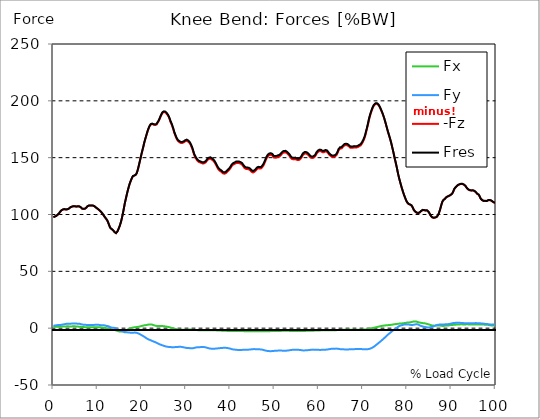
| Category |  Fx |  Fy |  -Fz |  Fres |
|---|---|---|---|---|
| 0.0 | 1.227 | 2.189 | 97.639 | 97.701 |
| 0.167348456675344 | 1.218 | 2.242 | 97.904 | 97.965 |
| 0.334696913350688 | 1.208 | 2.295 | 98.167 | 98.229 |
| 0.5020453700260321 | 1.224 | 2.42 | 98.421 | 98.483 |
| 0.669393826701376 | 1.251 | 2.552 | 98.758 | 98.821 |
| 0.83674228337672 | 1.284 | 2.647 | 99.334 | 99.397 |
| 1.0040907400520642 | 1.323 | 2.751 | 99.869 | 99.934 |
| 1.1621420602454444 | 1.335 | 2.792 | 100.426 | 100.49 |
| 1.3294905169207885 | 1.286 | 2.74 | 101.25 | 101.312 |
| 1.4968389735961325 | 1.319 | 2.765 | 102.236 | 102.298 |
| 1.6641874302714765 | 1.383 | 2.858 | 103.057 | 103.12 |
| 1.8315358869468206 | 1.393 | 2.967 | 103.669 | 103.733 |
| 1.9988843436221646 | 1.413 | 3.104 | 104.091 | 104.156 |
| 2.1662328002975086 | 1.427 | 3.234 | 104.389 | 104.458 |
| 2.333581256972853 | 1.452 | 3.364 | 104.589 | 104.661 |
| 2.5009297136481967 | 1.5 | 3.498 | 104.671 | 104.748 |
| 2.6682781703235405 | 1.525 | 3.621 | 104.635 | 104.716 |
| 2.8356266269988843 | 1.55 | 3.722 | 104.374 | 104.458 |
| 3.002975083674229 | 1.593 | 3.837 | 104.363 | 104.45 |
| 3.1703235403495724 | 1.637 | 3.936 | 104.536 | 104.626 |
| 3.337671997024917 | 1.618 | 3.928 | 104.8 | 104.89 |
| 3.4957233172182973 | 1.55 | 3.887 | 105.133 | 105.22 |
| 3.663071773893641 | 1.507 | 3.91 | 105.745 | 105.833 |
| 3.8304202305689854 | 1.492 | 3.934 | 106.253 | 106.342 |
| 3.997768687244329 | 1.521 | 3.979 | 106.552 | 106.642 |
| 4.165117143919673 | 1.573 | 4.021 | 106.832 | 106.923 |
| 4.332465600595017 | 1.604 | 4.064 | 107.047 | 107.14 |
| 4.499814057270361 | 1.614 | 4.112 | 107.211 | 107.307 |
| 4.667162513945706 | 1.615 | 4.148 | 107.327 | 107.424 |
| 4.834510970621049 | 1.587 | 4.143 | 107.241 | 107.338 |
| 5.001859427296393 | 1.576 | 4.159 | 107.006 | 107.104 |
| 5.169207883971737 | 1.563 | 4.107 | 106.921 | 107.019 |
| 5.336556340647081 | 1.485 | 3.984 | 106.991 | 107.082 |
| 5.503904797322425 | 1.413 | 3.951 | 107.129 | 107.218 |
| 5.671253253997769 | 1.353 | 3.913 | 107.203 | 107.291 |
| 5.82930457419115 | 1.322 | 3.869 | 107.107 | 107.193 |
| 5.996653030866494 | 1.302 | 3.783 | 106.836 | 106.92 |
| 6.164001487541838 | 1.25 | 3.656 | 106.428 | 106.509 |
| 6.331349944217181 | 1.089 | 3.383 | 105.656 | 105.737 |
| 6.498698400892526 | 0.983 | 3.192 | 105.103 | 105.185 |
| 6.66604685756787 | 0.958 | 3.105 | 104.977 | 105.06 |
| 6.833395314243213 | 0.94 | 2.985 | 104.899 | 104.979 |
| 7.000743770918558 | 0.919 | 2.94 | 104.937 | 105.018 |
| 7.168092227593902 | 0.897 | 2.927 | 105.117 | 105.199 |
| 7.335440684269246 | 0.869 | 2.905 | 105.516 | 105.602 |
| 7.50278914094459 | 0.826 | 2.827 | 106.142 | 106.231 |
| 7.6701375976199335 | 0.785 | 2.806 | 107.082 | 107.173 |
| 7.837486054295278 | 0.761 | 2.836 | 107.479 | 107.57 |
| 7.995537374488658 | 0.758 | 2.819 | 107.788 | 107.878 |
| 8.162885831164003 | 0.756 | 2.821 | 107.937 | 108.027 |
| 8.330234287839346 | 0.788 | 2.816 | 107.845 | 107.935 |
| 8.49758274451469 | 0.808 | 2.796 | 107.793 | 107.881 |
| 8.664931201190035 | 0.8 | 2.77 | 107.895 | 107.984 |
| 8.832279657865378 | 0.791 | 2.772 | 107.915 | 108.003 |
| 8.999628114540721 | 0.791 | 2.814 | 107.766 | 107.856 |
| 9.166976571216066 | 0.799 | 2.853 | 107.521 | 107.611 |
| 9.334325027891412 | 0.801 | 2.9 | 107.104 | 107.197 |
| 9.501673484566755 | 0.811 | 2.951 | 106.559 | 106.654 |
| 9.669021941242098 | 0.85 | 2.971 | 105.957 | 106.054 |
| 9.836370397917442 | 0.879 | 2.972 | 105.425 | 105.522 |
| 10.003718854592787 | 0.874 | 2.981 | 105.014 | 105.111 |
| 10.17106731126813 | 0.871 | 2.962 | 104.547 | 104.643 |
| 10.329118631461512 | 0.844 | 2.893 | 103.95 | 104.046 |
| 10.496467088136853 | 0.773 | 2.733 | 103.344 | 103.435 |
| 10.663815544812199 | 0.716 | 2.66 | 102.75 | 102.836 |
| 10.831164001487544 | 0.607 | 2.582 | 102.081 | 102.166 |
| 10.998512458162887 | 0.523 | 2.537 | 101.303 | 101.386 |
| 11.16586091483823 | 0.488 | 2.575 | 100.44 | 100.524 |
| 11.333209371513574 | 0.394 | 2.52 | 99.42 | 99.5 |
| 11.50055782818892 | 0.246 | 2.41 | 98.391 | 98.467 |
| 11.667906284864264 | 0.221 | 2.406 | 97.542 | 97.616 |
| 11.835254741539607 | 0.069 | 2.189 | 96.664 | 96.73 |
| 12.00260319821495 | -0.075 | 1.964 | 95.891 | 95.949 |
| 12.169951654890292 | -0.164 | 1.884 | 94.931 | 94.986 |
| 12.337300111565641 | -0.264 | 1.825 | 93.544 | 93.598 |
| 12.504648568240984 | -0.418 | 1.614 | 91.797 | 91.847 |
| 12.662699888434362 | -0.652 | 1.318 | 90.092 | 90.136 |
| 12.830048345109708 | -0.888 | 1.018 | 88.434 | 88.474 |
| 12.997396801785053 | -1.12 | 0.688 | 87.649 | 87.69 |
| 13.164745258460396 | -1.289 | 0.443 | 87.21 | 87.255 |
| 13.33209371513574 | -1.397 | 0.384 | 86.674 | 86.719 |
| 13.499442171811083 | -1.497 | 0.335 | 86.127 | 86.171 |
| 13.666790628486426 | -1.537 | 0.354 | 85.305 | 85.347 |
| 13.834139085161771 | -1.638 | 0.232 | 84.542 | 84.584 |
| 14.001487541837117 | -1.771 | 0.037 | 83.81 | 83.853 |
| 14.16883599851246 | -1.934 | -0.207 | 83.608 | 83.654 |
| 14.336184455187803 | -2.195 | -0.587 | 84.161 | 84.212 |
| 14.503532911863147 | -2.483 | -1.031 | 85.163 | 85.223 |
| 14.670881368538492 | -2.678 | -1.38 | 86.586 | 86.655 |
| 14.828932688731873 | -2.836 | -1.713 | 88.238 | 88.315 |
| 14.996281145407215 | -2.918 | -1.901 | 89.879 | 89.962 |
| 15.163629602082558 | -2.928 | -2.132 | 91.861 | 91.946 |
| 15.330978058757903 | -2.918 | -2.383 | 94.179 | 94.268 |
| 15.498326515433247 | -2.895 | -2.616 | 96.866 | 96.96 |
| 15.665674972108594 | -2.831 | -2.835 | 99.836 | 99.933 |
| 15.833023428783937 | -2.85 | -3.153 | 103.175 | 103.28 |
| 16.00037188545928 | -2.763 | -3.493 | 106.556 | 106.666 |
| 16.167720342134626 | -2.48 | -3.624 | 110.026 | 110.133 |
| 16.335068798809967 | -2.189 | -3.701 | 112.849 | 112.95 |
| 16.502417255485312 | -1.807 | -3.657 | 115.703 | 115.797 |
| 16.669765712160658 | -1.479 | -3.657 | 118.579 | 118.67 |
| 16.837114168836 | -1.118 | -3.727 | 121.236 | 121.326 |
| 17.004462625511344 | -0.846 | -3.803 | 123.563 | 123.652 |
| 17.16251394570472 | -0.578 | -3.887 | 125.869 | 125.962 |
| 17.32986240238007 | -0.287 | -3.928 | 127.875 | 127.967 |
| 17.497210859055414 | -0.078 | -3.942 | 129.539 | 129.632 |
| 17.664559315730756 | 0.131 | -3.955 | 131.168 | 131.261 |
| 17.8319077724061 | 0.344 | -3.959 | 132.624 | 132.715 |
| 17.999256229081443 | 0.557 | -3.976 | 133.735 | 133.826 |
| 18.166604685756788 | 0.732 | -3.982 | 134.373 | 134.464 |
| 18.333953142432133 | 0.807 | -3.912 | 134.26 | 134.35 |
| 18.501301599107478 | 0.871 | -3.864 | 134.293 | 134.381 |
| 18.668650055782823 | 0.919 | -3.93 | 135.079 | 135.17 |
| 18.835998512458165 | 0.956 | -4.073 | 136.283 | 136.38 |
| 19.00334696913351 | 1.064 | -4.282 | 138.127 | 138.231 |
| 19.170695425808855 | 1.197 | -4.569 | 140.448 | 140.561 |
| 19.338043882484197 | 1.331 | -4.882 | 143.14 | 143.263 |
| 19.496095202677576 | 1.464 | -5.199 | 145.962 | 146.093 |
| 19.66344365935292 | 1.594 | -5.536 | 148.767 | 148.908 |
| 19.830792116028263 | 1.746 | -5.914 | 151.546 | 151.702 |
| 19.998140572703612 | 1.929 | -6.263 | 154.257 | 154.429 |
| 20.165489029378953 | 2.105 | -6.623 | 156.81 | 156.998 |
| 20.3328374860543 | 2.312 | -7.005 | 159.408 | 159.613 |
| 20.500185942729644 | 2.481 | -7.436 | 162.173 | 162.397 |
| 20.667534399404985 | 2.613 | -7.843 | 164.721 | 164.963 |
| 20.83488285608033 | 2.665 | -8.315 | 166.979 | 167.246 |
| 21.002231312755672 | 2.712 | -8.761 | 169.156 | 169.445 |
| 21.16957976943102 | 2.85 | -9.177 | 171.44 | 171.75 |
| 21.336928226106362 | 3.026 | -9.52 | 173.482 | 173.812 |
| 21.504276682781704 | 3.147 | -9.847 | 175.268 | 175.614 |
| 21.67162513945705 | 3.243 | -10.14 | 176.86 | 177.221 |
| 21.82967645965043 | 3.307 | -10.393 | 178.12 | 178.494 |
| 21.997024916325774 | 3.328 | -10.638 | 179.061 | 179.448 |
| 22.16437337300112 | 3.282 | -10.919 | 179.568 | 179.969 |
| 22.33172182967646 | 3.126 | -11.225 | 179.59 | 180.005 |
| 22.499070286351806 | 2.901 | -11.552 | 179.518 | 179.946 |
| 22.666418743027148 | 2.636 | -11.791 | 179.016 | 179.457 |
| 22.833767199702496 | 2.411 | -12.008 | 178.712 | 179.166 |
| 23.00111565637784 | 2.236 | -12.239 | 178.749 | 179.216 |
| 23.168464113053183 | 2.079 | -12.516 | 178.784 | 179.269 |
| 23.335812569728528 | 1.977 | -12.872 | 179.164 | 179.673 |
| 23.50316102640387 | 1.926 | -13.145 | 180.262 | 180.787 |
| 23.670509483079215 | 1.872 | -13.508 | 181.297 | 181.846 |
| 23.83785793975456 | 1.782 | -13.864 | 182.34 | 182.912 |
| 23.995909259947936 | 1.794 | -14.166 | 183.823 | 184.414 |
| 24.163257716623285 | 1.837 | -14.393 | 185.38 | 185.984 |
| 24.330606173298627 | 1.826 | -14.617 | 186.921 | 187.538 |
| 24.49795462997397 | 1.848 | -14.849 | 188.187 | 188.82 |
| 24.665303086649313 | 1.854 | -15.091 | 189.315 | 189.964 |
| 24.83265154332466 | 1.794 | -15.36 | 189.917 | 190.587 |
| 25.0 | 1.709 | -15.596 | 190.097 | 190.783 |
| 25.167348456675345 | 1.621 | -15.788 | 190.119 | 190.82 |
| 25.334696913350694 | 1.52 | -15.954 | 189.787 | 190.501 |
| 25.502045370026035 | 1.406 | -16.118 | 189.221 | 189.95 |
| 25.669393826701377 | 1.279 | -16.273 | 188.417 | 189.158 |
| 25.836742283376722 | 1.176 | -16.369 | 187.467 | 188.22 |
| 26.004090740052067 | 1.04 | -16.468 | 186.4 | 187.164 |
| 26.17143919672741 | 0.884 | -16.568 | 185.012 | 185.789 |
| 26.329490516920792 | 0.739 | -16.579 | 183.338 | 184.121 |
| 26.49683897359613 | 0.502 | -16.557 | 181.304 | 182.086 |
| 26.66418743027148 | 0.225 | -16.698 | 179.931 | 180.728 |
| 26.831535886946828 | -0.009 | -16.844 | 178.258 | 179.074 |
| 26.998884343622166 | -0.176 | -16.908 | 176.29 | 177.119 |
| 27.166232800297514 | -0.298 | -16.796 | 174.226 | 175.058 |
| 27.333581256972852 | -0.458 | -16.701 | 171.947 | 172.784 |
| 27.5009297136482 | -0.583 | -16.65 | 170.187 | 171.03 |
| 27.668278170323543 | -0.737 | -16.633 | 168.476 | 169.327 |
| 27.835626626998888 | -0.889 | -16.559 | 166.985 | 167.838 |
| 28.002975083674233 | -1.019 | -16.506 | 165.722 | 166.578 |
| 28.170323540349575 | -1.132 | -16.471 | 164.741 | 165.6 |
| 28.33767199702492 | -1.244 | -16.45 | 164.166 | 165.028 |
| 28.50502045370026 | -1.307 | -16.395 | 163.648 | 164.508 |
| 28.663071773893645 | -1.341 | -16.413 | 163.255 | 164.122 |
| 28.830420230568986 | -1.374 | -16.454 | 162.972 | 163.847 |
| 28.99776868724433 | -1.388 | -16.48 | 162.768 | 163.648 |
| 29.165117143919673 | -1.369 | -16.568 | 162.956 | 163.846 |
| 29.33246560059502 | -1.391 | -16.773 | 163.407 | 164.317 |
| 29.499814057270367 | -1.384 | -16.904 | 163.549 | 164.471 |
| 29.66716251394571 | -1.407 | -17.034 | 164.041 | 164.974 |
| 29.834510970621054 | -1.407 | -17.167 | 164.452 | 165.396 |
| 30.00185942729639 | -1.399 | -17.304 | 164.82 | 165.776 |
| 30.169207883971744 | -1.379 | -17.412 | 164.907 | 165.874 |
| 30.33655634064708 | -1.361 | -17.5 | 164.628 | 165.607 |
| 30.50390479732243 | -1.282 | -17.531 | 164.073 | 165.06 |
| 30.671253253997772 | -1.196 | -17.536 | 163.492 | 164.484 |
| 30.829304574191156 | -1.142 | -17.586 | 162.702 | 163.706 |
| 30.996653030866494 | -1.159 | -17.634 | 161.59 | 162.607 |
| 31.164001487541842 | -1.222 | -17.672 | 160.172 | 161.201 |
| 31.331349944217187 | -1.284 | -17.641 | 158.608 | 159.642 |
| 31.498698400892525 | -1.364 | -17.624 | 156.786 | 157.827 |
| 31.666046857567874 | -1.466 | -17.564 | 154.568 | 155.615 |
| 31.833395314243212 | -1.56 | -17.361 | 152.417 | 153.455 |
| 32.00074377091856 | -1.603 | -17.249 | 150.981 | 152.015 |
| 32.1680922275939 | -1.617 | -17.069 | 149.728 | 150.749 |
| 32.33544068426925 | -1.659 | -16.908 | 148.713 | 149.721 |
| 32.50278914094459 | -1.7 | -16.836 | 147.67 | 148.678 |
| 32.670137597619934 | -1.746 | -16.789 | 146.885 | 147.893 |
| 32.83748605429528 | -1.781 | -16.757 | 146.376 | 147.383 |
| 33.004834510970625 | -1.821 | -16.742 | 145.967 | 146.975 |
| 33.162885831164004 | -1.84 | -16.71 | 145.802 | 146.807 |
| 33.33023428783935 | -1.831 | -16.648 | 145.65 | 146.649 |
| 33.497582744514695 | -1.802 | -16.563 | 145.287 | 146.279 |
| 33.664931201190036 | -1.768 | -16.485 | 144.861 | 145.848 |
| 33.83227965786538 | -1.75 | -16.488 | 144.817 | 145.804 |
| 33.99962811454073 | -1.766 | -16.532 | 145.022 | 146.013 |
| 34.16697657121607 | -1.781 | -16.665 | 145.188 | 146.194 |
| 34.33432502789141 | -1.783 | -16.821 | 145.531 | 146.554 |
| 34.50167348456676 | -1.766 | -16.951 | 146.133 | 147.168 |
| 34.6690219412421 | -1.778 | -17.135 | 147.082 | 148.133 |
| 34.83637039791744 | -1.782 | -17.387 | 148.032 | 149.105 |
| 35.00371885459279 | -1.786 | -17.533 | 148.606 | 149.693 |
| 35.17106731126814 | -1.8 | -17.731 | 148.875 | 149.984 |
| 35.338415767943474 | -1.802 | -17.9 | 149.118 | 150.247 |
| 35.49646708813686 | -1.805 | -17.976 | 149.158 | 150.295 |
| 35.6638155448122 | -1.816 | -18.033 | 148.893 | 150.041 |
| 35.831164001487544 | -1.856 | -18.12 | 148.326 | 149.493 |
| 35.998512458162885 | -1.866 | -18.176 | 147.865 | 149.043 |
| 36.165860914838234 | -1.867 | -18.197 | 147.347 | 148.531 |
| 36.333209371513576 | -1.867 | -18.15 | 146.524 | 147.709 |
| 36.50055782818892 | -1.877 | -18.079 | 145.584 | 146.767 |
| 36.667906284864266 | -1.896 | -17.967 | 144.478 | 145.655 |
| 36.83525474153961 | -1.938 | -17.914 | 143.197 | 144.379 |
| 37.002603198214956 | -1.985 | -17.896 | 141.905 | 143.095 |
| 37.1699516548903 | -1.993 | -17.81 | 140.634 | 141.825 |
| 37.337300111565646 | -2.011 | -17.662 | 139.671 | 140.85 |
| 37.50464856824098 | -2.08 | -17.59 | 138.878 | 140.057 |
| 37.66269988843437 | -2.108 | -17.565 | 138.424 | 139.605 |
| 37.83004834510971 | -2.136 | -17.532 | 138.099 | 139.277 |
| 37.99739680178505 | -2.176 | -17.496 | 137.503 | 138.682 |
| 38.16474525846039 | -2.192 | -17.409 | 136.727 | 137.903 |
| 38.33209371513574 | -2.232 | -17.334 | 136.235 | 137.406 |
| 38.49944217181109 | -2.278 | -17.279 | 135.97 | 137.138 |
| 38.666790628486424 | -2.307 | -17.264 | 135.898 | 137.065 |
| 38.83413908516178 | -2.339 | -17.258 | 135.936 | 137.102 |
| 39.001487541837115 | -2.353 | -17.292 | 136.399 | 137.566 |
| 39.16883599851246 | -2.384 | -17.364 | 137.041 | 138.214 |
| 39.336184455187805 | -2.399 | -17.458 | 137.748 | 138.928 |
| 39.503532911863154 | -2.421 | -17.563 | 138.412 | 139.602 |
| 39.670881368538495 | -2.449 | -17.715 | 138.964 | 140.167 |
| 39.83822982521384 | -2.444 | -17.869 | 139.638 | 140.857 |
| 39.996281145407224 | -2.436 | -17.978 | 140.585 | 141.808 |
| 40.163629602082565 | -2.465 | -18.175 | 141.631 | 142.871 |
| 40.33097805875791 | -2.481 | -18.484 | 142.776 | 144.046 |
| 40.498326515433256 | -2.479 | -18.619 | 143.405 | 144.685 |
| 40.6656749721086 | -2.48 | -18.728 | 143.922 | 145.212 |
| 40.83302342878393 | -2.479 | -18.821 | 144.264 | 145.561 |
| 41.00037188545929 | -2.462 | -18.879 | 144.571 | 145.872 |
| 41.16772034213463 | -2.469 | -18.98 | 144.858 | 146.17 |
| 41.33506879880997 | -2.475 | -19.046 | 145.233 | 146.549 |
| 41.50241725548531 | -2.489 | -19.056 | 145.418 | 146.733 |
| 41.66976571216066 | -2.523 | -19.123 | 145.335 | 146.659 |
| 41.837114168836 | -2.536 | -19.155 | 145.293 | 146.623 |
| 42.004462625511344 | -2.542 | -19.177 | 145.23 | 146.563 |
| 42.17181108218669 | -2.55 | -19.2 | 145.061 | 146.398 |
| 42.32986240238007 | -2.541 | -19.172 | 144.721 | 146.057 |
| 42.497210859055414 | -2.533 | -19.144 | 144.379 | 145.715 |
| 42.66455931573076 | -2.537 | -19.116 | 143.94 | 145.277 |
| 42.831907772406105 | -2.563 | -19.087 | 143.22 | 144.558 |
| 42.999256229081446 | -2.598 | -19.002 | 142.075 | 143.414 |
| 43.16660468575679 | -2.629 | -18.99 | 141.12 | 142.468 |
| 43.33395314243214 | -2.648 | -18.966 | 140.532 | 141.884 |
| 43.50130159910748 | -2.654 | -18.943 | 140.163 | 141.516 |
| 43.66865005578282 | -2.667 | -18.962 | 140.019 | 141.377 |
| 43.83599851245817 | -2.67 | -18.952 | 139.992 | 141.348 |
| 44.00334696913351 | -2.673 | -18.942 | 139.965 | 141.321 |
| 44.17069542580886 | -2.676 | -18.89 | 139.774 | 141.123 |
| 44.3380438824842 | -2.679 | -18.83 | 139.487 | 140.83 |
| 44.49609520267758 | -2.693 | -18.806 | 138.978 | 140.321 |
| 44.66344365935292 | -2.679 | -18.684 | 138.152 | 139.488 |
| 44.83079211602827 | -2.681 | -18.583 | 137.549 | 138.876 |
| 44.99814057270361 | -2.69 | -18.488 | 137.008 | 138.328 |
| 45.16548902937895 | -2.711 | -18.448 | 136.943 | 138.259 |
| 45.332837486054295 | -2.729 | -18.421 | 137.236 | 138.545 |
| 45.500185942729644 | -2.745 | -18.416 | 137.705 | 139.008 |
| 45.66753439940499 | -2.764 | -18.458 | 138.273 | 139.577 |
| 45.83488285608033 | -2.768 | -18.457 | 139.018 | 140.313 |
| 46.00223131275568 | -2.757 | -18.532 | 139.91 | 141.206 |
| 46.16957976943102 | -2.753 | -18.535 | 140.304 | 141.594 |
| 46.336928226106366 | -2.748 | -18.579 | 140.617 | 141.909 |
| 46.50427668278171 | -2.732 | -18.666 | 140.73 | 142.034 |
| 46.671625139457056 | -2.721 | -18.646 | 140.532 | 141.834 |
| 46.829676459650436 | -2.72 | -18.619 | 140.322 | 141.622 |
| 46.99702491632577 | -2.752 | -18.736 | 140.611 | 141.926 |
| 47.16437337300112 | -2.789 | -18.846 | 141.256 | 142.58 |
| 47.33172182967646 | -2.807 | -19.002 | 142.176 | 143.512 |
| 47.49907028635181 | -2.818 | -19.184 | 143.251 | 144.603 |
| 47.66641874302716 | -2.822 | -19.399 | 144.57 | 145.938 |
| 47.83376719970249 | -2.818 | -19.58 | 145.975 | 147.352 |
| 48.001115656377834 | -2.823 | -19.707 | 147.664 | 149.043 |
| 48.16846411305319 | -2.821 | -19.844 | 149.185 | 150.566 |
| 48.33581256972853 | -2.783 | -19.985 | 150.265 | 151.654 |
| 48.50316102640387 | -2.755 | -20.096 | 151.233 | 152.627 |
| 48.67050948307921 | -2.705 | -20.166 | 151.915 | 153.312 |
| 48.837857939754564 | -2.65 | -20.199 | 152.314 | 153.71 |
| 49.005206396429905 | -2.611 | -20.219 | 152.543 | 153.939 |
| 49.163257716623285 | -2.569 | -20.201 | 152.503 | 153.897 |
| 49.33060617329863 | -2.529 | -20.198 | 152.298 | 153.693 |
| 49.49795462997397 | -2.514 | -20.172 | 151.97 | 153.364 |
| 49.66530308664932 | -2.505 | -20.106 | 151.15 | 152.541 |
| 49.832651543324666 | -2.514 | -19.957 | 150.131 | 151.512 |
| 50.0 | -2.49 | -19.938 | 149.88 | 151.261 |
| 50.16734845667534 | -2.464 | -19.894 | 149.969 | 151.343 |
| 50.33469691335069 | -2.427 | -19.863 | 150.023 | 151.392 |
| 50.50204537002604 | -2.431 | -19.805 | 150.22 | 151.579 |
| 50.66939382670139 | -2.462 | -19.766 | 150.48 | 151.831 |
| 50.836742283376715 | -2.469 | -19.731 | 150.764 | 152.105 |
| 51.00409074005207 | -2.474 | -19.735 | 150.926 | 152.265 |
| 51.17143919672741 | -2.448 | -19.736 | 151.219 | 152.554 |
| 51.32949051692079 | -2.424 | -19.722 | 151.825 | 153.153 |
| 51.496838973596134 | -2.401 | -19.734 | 152.547 | 153.87 |
| 51.66418743027148 | -2.379 | -19.755 | 153.323 | 154.644 |
| 51.831535886946824 | -2.383 | -19.793 | 154.034 | 155.353 |
| 51.99888434362217 | -2.38 | -19.805 | 154.368 | 155.687 |
| 52.16623280029752 | -2.375 | -19.828 | 154.629 | 155.95 |
| 52.33358125697285 | -2.345 | -19.826 | 154.74 | 156.061 |
| 52.5009297136482 | -2.329 | -19.81 | 154.664 | 155.985 |
| 52.668278170323546 | -2.329 | -19.785 | 154.462 | 155.782 |
| 52.835626626998895 | -2.329 | -19.754 | 153.898 | 155.219 |
| 53.00297508367424 | -2.343 | -19.667 | 153.267 | 154.581 |
| 53.17032354034958 | -2.36 | -19.563 | 152.614 | 153.921 |
| 53.33767199702492 | -2.388 | -19.478 | 151.842 | 153.145 |
| 53.50502045370027 | -2.406 | -19.392 | 151.063 | 152.362 |
| 53.663071773893655 | -2.421 | -19.242 | 149.971 | 151.261 |
| 53.83042023056899 | -2.439 | -19.135 | 149.202 | 150.485 |
| 53.99776868724433 | -2.47 | -19.079 | 148.782 | 150.064 |
| 54.16511714391967 | -2.511 | -19.061 | 148.544 | 149.827 |
| 54.33246560059503 | -2.536 | -19.075 | 148.501 | 149.788 |
| 54.49981405727037 | -2.54 | -19.053 | 148.642 | 149.924 |
| 54.667162513945705 | -2.537 | -19.032 | 148.777 | 150.053 |
| 54.834510970621054 | -2.535 | -19.021 | 148.52 | 149.796 |
| 55.0018594272964 | -2.547 | -19.025 | 148.193 | 149.475 |
| 55.169207883971744 | -2.563 | -19.023 | 147.98 | 149.265 |
| 55.336556340647086 | -2.58 | -19.018 | 147.861 | 149.146 |
| 55.50390479732243 | -2.603 | -19.089 | 147.862 | 149.158 |
| 55.671253253997776 | -2.602 | -19.15 | 148.191 | 149.493 |
| 55.83860171067312 | -2.605 | -19.198 | 148.767 | 150.071 |
| 55.9966530308665 | -2.587 | -19.289 | 149.566 | 150.876 |
| 56.16400148754184 | -2.575 | -19.436 | 150.607 | 151.926 |
| 56.33134994421718 | -2.543 | -19.534 | 151.824 | 153.146 |
| 56.498698400892536 | -2.506 | -19.576 | 152.741 | 154.06 |
| 56.66604685756788 | -2.462 | -19.585 | 153.279 | 154.593 |
| 56.83339531424321 | -2.433 | -19.537 | 153.642 | 154.946 |
| 57.00074377091856 | -2.404 | -19.503 | 153.72 | 155.018 |
| 57.16809222759391 | -2.379 | -19.479 | 153.577 | 154.873 |
| 57.33544068426925 | -2.337 | -19.434 | 153.254 | 154.546 |
| 57.5027891409446 | -2.279 | -19.37 | 152.948 | 154.233 |
| 57.670137597619934 | -2.237 | -19.3 | 152.421 | 153.702 |
| 57.83748605429528 | -2.233 | -19.258 | 151.504 | 152.785 |
| 58.004834510970625 | -2.231 | -19.15 | 150.72 | 151.993 |
| 58.16288583116401 | -2.242 | -19.05 | 150.116 | 151.381 |
| 58.330234287839346 | -2.254 | -18.997 | 149.719 | 150.98 |
| 58.497582744514695 | -2.241 | -18.935 | 149.668 | 150.922 |
| 58.66493120119004 | -2.221 | -18.874 | 149.808 | 151.053 |
| 58.832279657865385 | -2.193 | -18.891 | 149.999 | 151.243 |
| 58.999628114540734 | -2.165 | -18.893 | 150.446 | 151.686 |
| 59.16697657121607 | -2.113 | -18.894 | 151.157 | 152.39 |
| 59.33432502789142 | -2.073 | -18.886 | 152.174 | 153.397 |
| 59.50167348456676 | -2.012 | -18.906 | 153.541 | 154.757 |
| 59.66902194124211 | -1.999 | -18.927 | 154.383 | 155.594 |
| 59.83637039791745 | -2.003 | -19.009 | 155.051 | 156.267 |
| 60.00371885459278 | -1.998 | -19.085 | 155.591 | 156.812 |
| 60.17106731126813 | -1.98 | -19.124 | 155.846 | 157.07 |
| 60.33841576794349 | -1.951 | -19.127 | 155.813 | 157.038 |
| 60.49646708813685 | -1.924 | -19.109 | 155.683 | 156.908 |
| 60.6638155448122 | -1.885 | -19.075 | 155.288 | 156.511 |
| 60.831164001487544 | -1.882 | -19.021 | 154.874 | 156.093 |
| 60.99851245816289 | -1.873 | -18.971 | 154.715 | 155.93 |
| 61.16586091483824 | -1.864 | -18.934 | 154.762 | 155.972 |
| 61.333209371513576 | -1.868 | -18.923 | 155.143 | 156.35 |
| 61.50055782818892 | -1.864 | -18.909 | 155.493 | 156.698 |
| 61.667906284864266 | -1.84 | -18.882 | 155.588 | 156.789 |
| 61.835254741539615 | -1.836 | -18.836 | 155.275 | 156.473 |
| 62.002603198214956 | -1.843 | -18.754 | 154.722 | 155.915 |
| 62.16995165489029 | -1.858 | -18.645 | 153.767 | 154.954 |
| 62.33730011156564 | -1.873 | -18.512 | 152.736 | 153.915 |
| 62.504648568240995 | -1.874 | -18.395 | 152.025 | 153.196 |
| 62.67199702491633 | -1.85 | -18.274 | 151.621 | 152.781 |
| 62.83004834510971 | -1.818 | -18.163 | 151.095 | 152.245 |
| 62.99739680178505 | -1.803 | -18.069 | 150.737 | 151.878 |
| 63.1647452584604 | -1.793 | -18.017 | 150.661 | 151.793 |
| 63.33209371513575 | -1.789 | -18.008 | 150.738 | 151.868 |
| 63.4994421718111 | -1.791 | -18.016 | 150.835 | 151.964 |
| 63.666790628486424 | -1.788 | -18.007 | 151.043 | 152.168 |
| 63.83413908516177 | -1.773 | -17.98 | 151.509 | 152.627 |
| 64.00148754183712 | -1.749 | -17.993 | 152.196 | 153.31 |
| 64.16883599851248 | -1.699 | -18.021 | 153.358 | 154.468 |
| 64.3361844551878 | -1.638 | -18.094 | 154.925 | 156.034 |
| 64.50353291186315 | -1.568 | -18.259 | 156.592 | 157.707 |
| 64.6708813685385 | -1.545 | -18.378 | 157.324 | 158.45 |
| 64.83822982521384 | -1.522 | -18.477 | 157.996 | 159.129 |
| 65.00557828188919 | -1.5 | -18.54 | 158.27 | 159.408 |
| 65.16362960208257 | -1.475 | -18.542 | 158.175 | 159.314 |
| 65.3309780587579 | -1.449 | -18.525 | 158.344 | 159.48 |
| 65.49832651543326 | -1.411 | -18.578 | 159.628 | 160.763 |
| 65.6656749721086 | -1.356 | -18.636 | 160.456 | 161.593 |
| 65.83302342878395 | -1.344 | -18.684 | 160.846 | 161.989 |
| 66.00037188545929 | -1.331 | -18.707 | 161.043 | 162.19 |
| 66.16772034213463 | -1.321 | -18.751 | 161.077 | 162.229 |
| 66.33506879880998 | -1.3 | -18.777 | 160.994 | 162.151 |
| 66.50241725548531 | -1.27 | -18.786 | 160.81 | 161.97 |
| 66.66976571216065 | -1.249 | -18.75 | 160.45 | 161.608 |
| 66.83711416883601 | -1.26 | -18.65 | 159.843 | 160.995 |
| 67.00446262551135 | -1.277 | -18.545 | 159.217 | 160.362 |
| 67.1718110821867 | -1.299 | -18.456 | 158.65 | 159.79 |
| 67.32986240238007 | -1.323 | -18.44 | 158.535 | 159.675 |
| 67.49721085905541 | -1.333 | -18.461 | 158.613 | 159.757 |
| 67.66455931573076 | -1.324 | -18.468 | 158.707 | 159.851 |
| 67.83190777240611 | -1.317 | -18.469 | 158.83 | 159.972 |
| 67.99925622908145 | -1.31 | -18.457 | 159.001 | 160.14 |
| 68.16660468575678 | -1.319 | -18.461 | 159.034 | 160.173 |
| 68.33395314243214 | -1.323 | -18.411 | 158.974 | 160.108 |
| 68.50130159910749 | -1.308 | -18.358 | 158.882 | 160.011 |
| 68.66865005578282 | -1.294 | -18.336 | 158.918 | 160.043 |
| 68.83599851245816 | -1.32 | -18.337 | 159.318 | 160.44 |
| 69.00334696913352 | -1.311 | -18.344 | 159.881 | 160.999 |
| 69.17069542580886 | -1.295 | -18.35 | 160.126 | 161.243 |
| 69.3380438824842 | -1.281 | -18.341 | 160.309 | 161.424 |
| 69.50539233915956 | -1.287 | -18.318 | 160.789 | 161.9 |
| 69.66344365935292 | -1.288 | -18.368 | 161.636 | 162.75 |
| 69.83079211602826 | -1.283 | -18.484 | 162.807 | 163.926 |
| 69.99814057270362 | -1.279 | -18.601 | 163.977 | 165.103 |
| 70.16548902937896 | -1.244 | -18.64 | 165.434 | 166.553 |
| 70.33283748605429 | -1.195 | -18.644 | 167.022 | 168.13 |
| 70.50018594272964 | -1.148 | -18.691 | 169.009 | 170.107 |
| 70.667534399405 | -1.077 | -18.63 | 171.639 | 172.709 |
| 70.83488285608033 | -0.954 | -18.55 | 174.212 | 175.25 |
| 71.00223131275568 | -0.853 | -18.473 | 176.87 | 177.882 |
| 71.16957976943102 | -0.735 | -18.461 | 179.703 | 180.694 |
| 71.33692822610637 | -0.591 | -18.395 | 182.764 | 183.73 |
| 71.50427668278171 | -0.436 | -18.172 | 185.374 | 186.302 |
| 71.67162513945706 | -0.29 | -17.951 | 187.668 | 188.56 |
| 71.8389735961324 | -0.151 | -17.679 | 189.759 | 190.613 |
| 71.99702491632577 | -0.022 | -17.392 | 191.626 | 192.442 |
| 72.16437337300113 | 0.111 | -17.055 | 193.363 | 194.138 |
| 72.33172182967647 | 0.249 | -16.691 | 194.783 | 195.52 |
| 72.49907028635181 | 0.384 | -16.275 | 195.929 | 196.623 |
| 72.66641874302715 | 0.519 | -15.767 | 196.751 | 197.4 |
| 72.8337671997025 | 0.676 | -15.263 | 197.313 | 197.92 |
| 73.00111565637783 | 0.836 | -14.725 | 197.486 | 198.051 |
| 73.16846411305319 | 1.009 | -14.204 | 197.394 | 197.923 |
| 73.33581256972853 | 1.179 | -13.67 | 197.019 | 197.51 |
| 73.50316102640387 | 1.307 | -13.129 | 196.373 | 196.83 |
| 73.67050948307921 | 1.47 | -12.6 | 195.362 | 195.788 |
| 73.83785793975457 | 1.595 | -12.058 | 194.257 | 194.651 |
| 74.00520639642991 | 1.764 | -11.563 | 192.785 | 193.157 |
| 74.16325771662328 | 1.907 | -11.042 | 191.237 | 191.583 |
| 74.33060617329863 | 2.028 | -10.418 | 189.747 | 190.065 |
| 74.49795462997398 | 2.144 | -9.9 | 188.043 | 188.339 |
| 74.66530308664932 | 2.23 | -9.28 | 186.213 | 186.487 |
| 74.83265154332466 | 2.308 | -8.693 | 184.178 | 184.427 |
| 75.00000000000001 | 2.39 | -8.081 | 182.004 | 182.226 |
| 75.16734845667534 | 2.495 | -7.441 | 179.713 | 179.91 |
| 75.3346969133507 | 2.57 | -6.836 | 177.272 | 177.449 |
| 75.50204537002605 | 2.616 | -6.243 | 174.888 | 175.044 |
| 75.66939382670138 | 2.664 | -5.64 | 172.597 | 172.741 |
| 75.83674228337672 | 2.7 | -5.085 | 170.457 | 170.591 |
| 76.00409074005208 | 2.768 | -4.57 | 168.321 | 168.447 |
| 76.17143919672742 | 2.839 | -4.051 | 166.147 | 166.264 |
| 76.33878765340276 | 2.927 | -3.51 | 163.72 | 163.829 |
| 76.49683897359614 | 3.021 | -2.946 | 161.129 | 161.228 |
| 76.66418743027148 | 3.122 | -2.37 | 158.349 | 158.436 |
| 76.83153588694682 | 3.252 | -1.913 | 155.58 | 155.664 |
| 76.99888434362218 | 3.371 | -1.448 | 152.642 | 152.721 |
| 77.16623280029752 | 3.487 | -0.858 | 149.507 | 149.578 |
| 77.33358125697285 | 3.572 | -0.41 | 146.866 | 146.938 |
| 77.5009297136482 | 3.634 | 0 | 144.005 | 144.079 |
| 77.66827817032356 | 3.693 | 0.408 | 141.125 | 141.202 |
| 77.83562662699889 | 3.783 | 0.904 | 137.831 | 137.907 |
| 78.00297508367423 | 3.885 | 1.34 | 134.817 | 134.9 |
| 78.17032354034959 | 4.013 | 1.714 | 132.083 | 132.175 |
| 78.33767199702493 | 4.076 | 2.067 | 129.628 | 129.727 |
| 78.50502045370027 | 4.116 | 2.283 | 127.197 | 127.304 |
| 78.67236891037561 | 4.111 | 2.507 | 124.846 | 124.959 |
| 78.83042023056899 | 4.17 | 2.671 | 122.693 | 122.811 |
| 78.99776868724433 | 4.264 | 2.851 | 120.564 | 120.69 |
| 79.16511714391969 | 4.36 | 3.024 | 118.527 | 118.661 |
| 79.33246560059503 | 4.455 | 3.182 | 116.668 | 116.808 |
| 79.49981405727036 | 4.493 | 3.197 | 115.003 | 115.145 |
| 79.66716251394571 | 4.585 | 3.224 | 113.348 | 113.496 |
| 79.83451097062107 | 4.782 | 3.278 | 111.786 | 111.946 |
| 80.00185942729641 | 4.937 | 3.277 | 110.593 | 110.761 |
| 80.16920788397174 | 5.031 | 3.239 | 109.72 | 109.892 |
| 80.33655634064709 | 5.075 | 3.183 | 109.106 | 109.279 |
| 80.50390479732243 | 5.088 | 3.104 | 108.757 | 108.929 |
| 80.67125325399778 | 5.111 | 2.928 | 108.662 | 108.831 |
| 80.83860171067312 | 5.194 | 2.811 | 108.409 | 108.581 |
| 80.99665303086651 | 5.411 | 2.818 | 107.783 | 107.969 |
| 81.16400148754184 | 5.602 | 2.844 | 106.68 | 106.879 |
| 81.3313499442172 | 5.767 | 2.867 | 105.32 | 105.531 |
| 81.49869840089255 | 5.896 | 3.022 | 103.893 | 104.12 |
| 81.66604685756786 | 5.922 | 3.15 | 103.013 | 103.248 |
| 81.83339531424322 | 5.897 | 3.326 | 102.379 | 102.619 |
| 82.00074377091858 | 5.891 | 3.438 | 101.826 | 102.072 |
| 82.16809222759392 | 5.728 | 3.44 | 101.449 | 101.685 |
| 82.33544068426926 | 5.464 | 3.373 | 101.139 | 101.359 |
| 82.50278914094459 | 5.233 | 3.196 | 101.204 | 101.407 |
| 82.67013759761994 | 5.055 | 2.855 | 101.399 | 101.591 |
| 82.83748605429528 | 4.899 | 2.472 | 101.696 | 101.879 |
| 83.00483451097062 | 4.817 | 2.158 | 102.248 | 102.43 |
| 83.17218296764597 | 4.693 | 1.94 | 102.976 | 103.153 |
| 83.33023428783935 | 4.55 | 1.719 | 103.686 | 103.857 |
| 83.4975827445147 | 4.441 | 1.53 | 103.909 | 104.077 |
| 83.66493120119004 | 4.373 | 1.359 | 103.979 | 104.14 |
| 83.83227965786537 | 4.309 | 1.2 | 103.75 | 103.913 |
| 83.99962811454073 | 4.237 | 1.035 | 103.503 | 103.665 |
| 84.16697657121607 | 4.093 | 0.846 | 103.453 | 103.61 |
| 84.33432502789142 | 3.936 | 0.774 | 103.55 | 103.7 |
| 84.50167348456677 | 3.765 | 0.719 | 103.519 | 103.66 |
| 84.6690219412421 | 3.561 | 0.627 | 103.052 | 103.183 |
| 84.83637039791745 | 3.398 | 0.573 | 102.288 | 102.413 |
| 85.0037188545928 | 3.181 | 0.631 | 101.221 | 101.337 |
| 85.17106731126813 | 2.907 | 0.786 | 100.085 | 100.192 |
| 85.33841576794349 | 2.679 | 0.975 | 98.873 | 98.978 |
| 85.50576422461883 | 2.553 | 1.162 | 98.048 | 98.152 |
| 85.66381554481221 | 2.411 | 1.306 | 97.448 | 97.553 |
| 85.83116400148755 | 2.238 | 1.471 | 97.188 | 97.292 |
| 85.99851245816289 | 2.215 | 1.701 | 97.072 | 97.169 |
| 86.16586091483823 | 2.225 | 1.951 | 97.025 | 97.116 |
| 86.33320937151358 | 2.226 | 2.225 | 97.303 | 97.393 |
| 86.50055782818893 | 2.242 | 2.476 | 97.591 | 97.68 |
| 86.66790628486427 | 2.306 | 2.697 | 97.791 | 97.885 |
| 86.83525474153961 | 2.422 | 2.896 | 98.467 | 98.569 |
| 87.00260319821496 | 2.434 | 3.037 | 99.536 | 99.644 |
| 87.16995165489031 | 2.404 | 3.089 | 101.106 | 101.217 |
| 87.33730011156564 | 2.349 | 3.165 | 102.993 | 103.107 |
| 87.504648568241 | 2.277 | 3.208 | 105.085 | 105.2 |
| 87.67199702491634 | 2.167 | 3.289 | 107.505 | 107.618 |
| 87.83004834510972 | 2.048 | 3.315 | 109.805 | 109.913 |
| 87.99739680178506 | 1.982 | 3.254 | 111.522 | 111.627 |
| 88.1647452584604 | 1.962 | 3.209 | 112.583 | 112.687 |
| 88.33209371513574 | 2.023 | 3.216 | 113.289 | 113.394 |
| 88.49944217181108 | 2.19 | 3.275 | 113.585 | 113.695 |
| 88.66679062848644 | 2.296 | 3.411 | 114.231 | 114.349 |
| 88.83413908516178 | 2.298 | 3.485 | 115.103 | 115.223 |
| 89.00148754183712 | 2.25 | 3.443 | 115.575 | 115.692 |
| 89.16883599851246 | 2.307 | 3.481 | 115.869 | 115.985 |
| 89.33618445518782 | 2.397 | 3.554 | 116.183 | 116.299 |
| 89.50353291186315 | 2.528 | 3.675 | 116.463 | 116.582 |
| 89.6708813685385 | 2.648 | 3.79 | 116.764 | 116.888 |
| 89.83822982521386 | 2.735 | 3.878 | 117.154 | 117.279 |
| 90.00557828188919 | 2.799 | 4.091 | 117.573 | 117.695 |
| 90.16362960208257 | 2.822 | 4.246 | 118.302 | 118.423 |
| 90.3309780587579 | 2.895 | 4.43 | 119.387 | 119.511 |
| 90.49832651543326 | 2.918 | 4.473 | 120.949 | 121.073 |
| 90.66567497210859 | 2.941 | 4.553 | 122.494 | 122.621 |
| 90.83302342878395 | 3.005 | 4.675 | 123.377 | 123.507 |
| 91.00037188545929 | 3.092 | 4.695 | 124.042 | 124.174 |
| 91.16772034213463 | 3.162 | 4.7 | 124.714 | 124.848 |
| 91.33506879880998 | 3.22 | 4.705 | 125.401 | 125.535 |
| 91.50241725548533 | 3.259 | 4.716 | 125.907 | 126.041 |
| 91.66976571216065 | 3.295 | 4.727 | 126.349 | 126.483 |
| 91.83711416883601 | 3.332 | 4.715 | 126.525 | 126.661 |
| 92.00446262551137 | 3.335 | 4.666 | 126.698 | 126.832 |
| 92.1718110821867 | 3.336 | 4.617 | 126.868 | 126.999 |
| 92.33915953886203 | 3.346 | 4.554 | 126.911 | 127.041 |
| 92.49721085905541 | 3.317 | 4.52 | 126.826 | 126.954 |
| 92.66455931573077 | 3.318 | 4.471 | 126.58 | 126.707 |
| 92.83190777240611 | 3.321 | 4.419 | 126.23 | 126.355 |
| 92.99925622908145 | 3.311 | 4.369 | 125.771 | 125.894 |
| 93.1666046857568 | 3.34 | 4.361 | 125.138 | 125.264 |
| 93.33395314243214 | 3.337 | 4.258 | 124.379 | 124.503 |
| 93.50130159910749 | 3.343 | 4.264 | 123.193 | 123.319 |
| 93.66865005578283 | 3.349 | 4.256 | 122.377 | 122.504 |
| 93.83599851245818 | 3.321 | 4.25 | 121.926 | 122.052 |
| 94.00334696913353 | 3.307 | 4.263 | 121.604 | 121.73 |
| 94.17069542580886 | 3.302 | 4.274 | 121.302 | 121.429 |
| 94.3380438824842 | 3.291 | 4.254 | 121.05 | 121.176 |
| 94.50539233915954 | 3.266 | 4.236 | 121.056 | 121.181 |
| 94.66344365935292 | 3.267 | 4.289 | 121.209 | 121.336 |
| 94.83079211602828 | 3.289 | 4.335 | 121.17 | 121.3 |
| 94.99814057270362 | 3.305 | 4.377 | 120.996 | 121.128 |
| 95.16548902937897 | 3.296 | 4.419 | 120.75 | 120.883 |
| 95.33283748605432 | 3.267 | 4.436 | 120.279 | 120.414 |
| 95.50018594272963 | 3.265 | 4.455 | 119.718 | 119.854 |
| 95.66753439940499 | 3.259 | 4.445 | 119.057 | 119.194 |
| 95.83488285608034 | 3.216 | 4.379 | 118.174 | 118.309 |
| 96.00223131275567 | 3.145 | 4.293 | 117.85 | 117.981 |
| 96.16957976943102 | 3.127 | 4.316 | 117.391 | 117.522 |
| 96.33692822610638 | 3.208 | 4.337 | 116.301 | 116.438 |
| 96.50427668278171 | 3.193 | 4.249 | 114.799 | 114.934 |
| 96.67162513945706 | 3.2 | 4.183 | 113.658 | 113.792 |
| 96.8389735961324 | 3.188 | 4.097 | 112.881 | 113.012 |
| 96.99702491632577 | 3.163 | 4.054 | 112.439 | 112.567 |
| 97.16437337300111 | 3.147 | 4.056 | 112.099 | 112.226 |
| 97.33172182967647 | 3.122 | 3.966 | 111.861 | 111.985 |
| 97.49907028635181 | 3.086 | 3.84 | 111.765 | 111.884 |
| 97.66641874302715 | 3.069 | 3.764 | 111.886 | 112.002 |
| 97.8337671997025 | 3.09 | 3.749 | 111.962 | 112.078 |
| 98.00111565637785 | 3.074 | 3.694 | 111.826 | 111.94 |
| 98.16846411305319 | 2.993 | 3.609 | 112.198 | 112.307 |
| 98.33581256972855 | 2.86 | 3.489 | 112.553 | 112.654 |
| 98.50316102640389 | 2.713 | 3.375 | 112.681 | 112.776 |
| 98.67050948307921 | 2.598 | 3.285 | 112.642 | 112.732 |
| 98.83785793975456 | 2.474 | 3.193 | 112.522 | 112.607 |
| 99.0052063964299 | 2.393 | 3.108 | 112.278 | 112.359 |
| 99.17255485310525 | 2.353 | 3.077 | 111.882 | 111.963 |
| 99.33060617329863 | 2.377 | 3.13 | 111.259 | 111.341 |
| 99.49795462997399 | 2.436 | 3.167 | 110.814 | 110.897 |
| 99.66530308664933 | 2.483 | 3.191 | 110.522 | 110.607 |
| 99.83265154332467 | 2.445 | 3.193 | 110.457 | 110.54 |
| 100.0 | 2.531 | 3.227 | 110.175 | 110.262 |